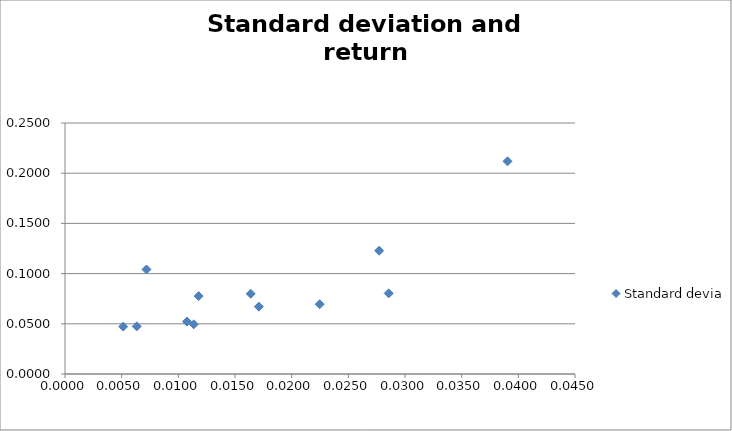
| Category | Standard deviation |
|---|---|
| 0.01638817442177019 | 0.08 |
| 0.006328368644814125 | 0.047 |
| 0.02855864367896414 | 0.08 |
| 0.03904695508262597 | 0.212 |
| 0.0051367915324636425 | 0.047 |
| 0.0071879892270765074 | 0.104 |
| 0.011358271533292158 | 0.049 |
| 0.02247340905036716 | 0.069 |
| 0.010762482977116912 | 0.052 |
| 0.011788081824423346 | 0.078 |
| 0.027717564752198078 | 0.123 |
| 0.017107820431285763 | 0.067 |